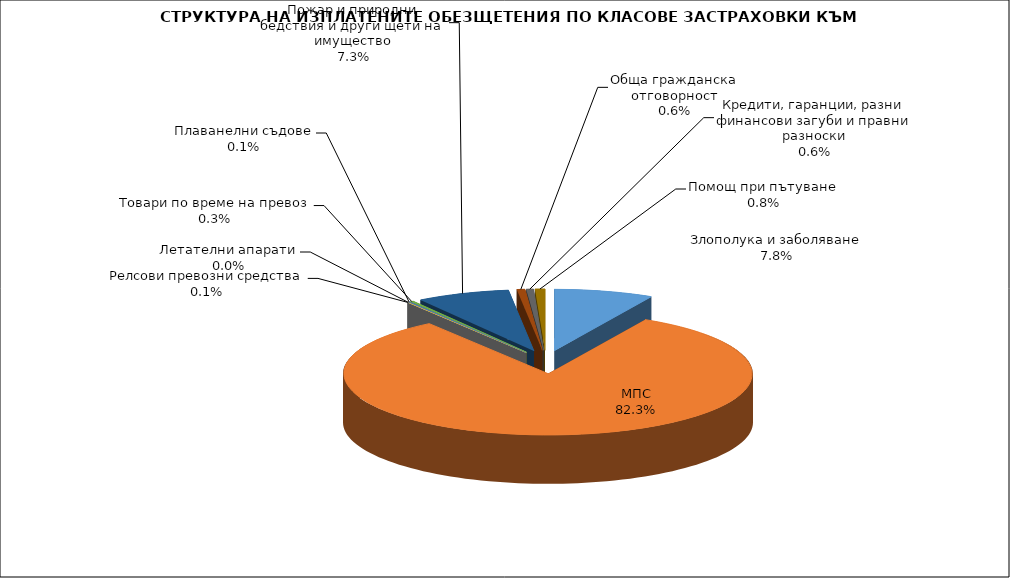
| Category | Злополука и заболяване |
|---|---|
| Злополука и заболяване | 0.078 |
| МПС | 0.823 |
| Релсови превозни средства | 0.001 |
| Летателни апарати | 0 |
| Плаванелни съдове | 0.001 |
| Товари по време на превоз | 0.003 |
| Пожар и природни бедствия и други щети на имущество | 0.073 |
| Обща гражданска отговорност | 0.006 |
| Кредити, гаранции, разни финансови загуби и правни разноски | 0.006 |
| Помощ при пътуване | 0.008 |